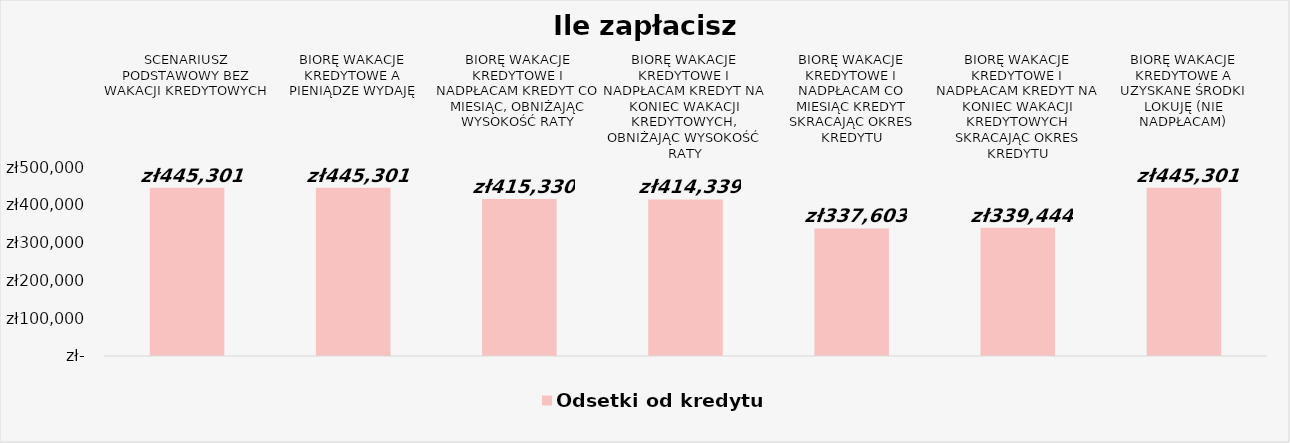
| Category | Odsetki od kredytu |
|---|---|
| SCENARIUSZ PODSTAWOWY BEZ WAKACJI KREDYTOWYCH | 445300.778 |
| BIORĘ WAKACJE KREDYTOWE A PIENIĄDZE WYDAJĘ | 445300.778 |
| BIORĘ WAKACJE KREDYTOWE I NADPŁACAM KREDYT CO MIESIĄC, OBNIŻAJĄC WYSOKOŚĆ RATY | 415330.075 |
| BIORĘ WAKACJE KREDYTOWE I NADPŁACAM KREDYT NA KONIEC WAKACJI KREDYTOWYCH, OBNIŻAJĄC WYSOKOŚĆ RATY | 414339.238 |
| BIORĘ WAKACJE KREDYTOWE I NADPŁACAM CO MIESIĄC KREDYT SKRACAJĄC OKRES KREDYTU | 337603.181 |
| BIORĘ WAKACJE KREDYTOWE I NADPŁACAM KREDYT NA KONIEC WAKACJI KREDYTOWYCH SKRACAJĄC OKRES KREDYTU | 339444.069 |
| BIORĘ WAKACJE KREDYTOWE A UZYSKANE ŚRODKI LOKUJĘ (NIE NADPŁACAM) | 445300.778 |